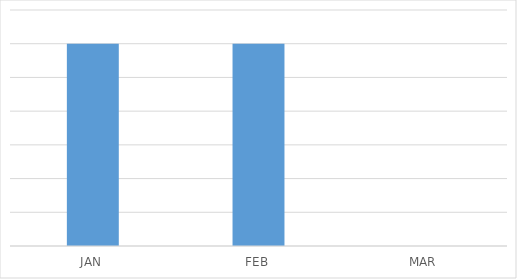
| Category | text1 |
|---|---|
| JAN | 6002 |
| FEB | 5998 |
| MAR | 1 |